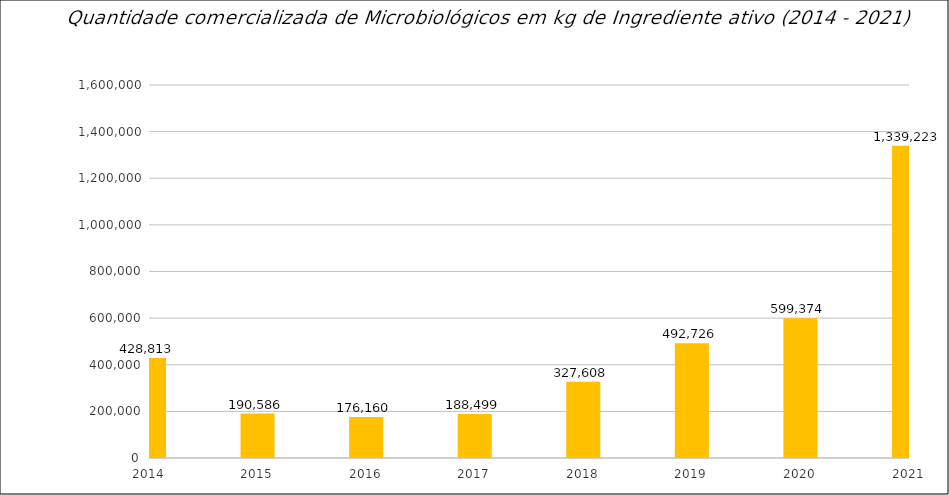
| Category | Vendas Internas |
|---|---|
| 2014.0 | 428812.611 |
| 2015.0 | 190585.567 |
| 2016.0 | 176159.696 |
| 2017.0 | 188499.34 |
| 2018.0 | 327607.54 |
| 2019.0 | 492725.958 |
| 2020.0 | 599373.97 |
| 2021.0 | 1339222.964 |